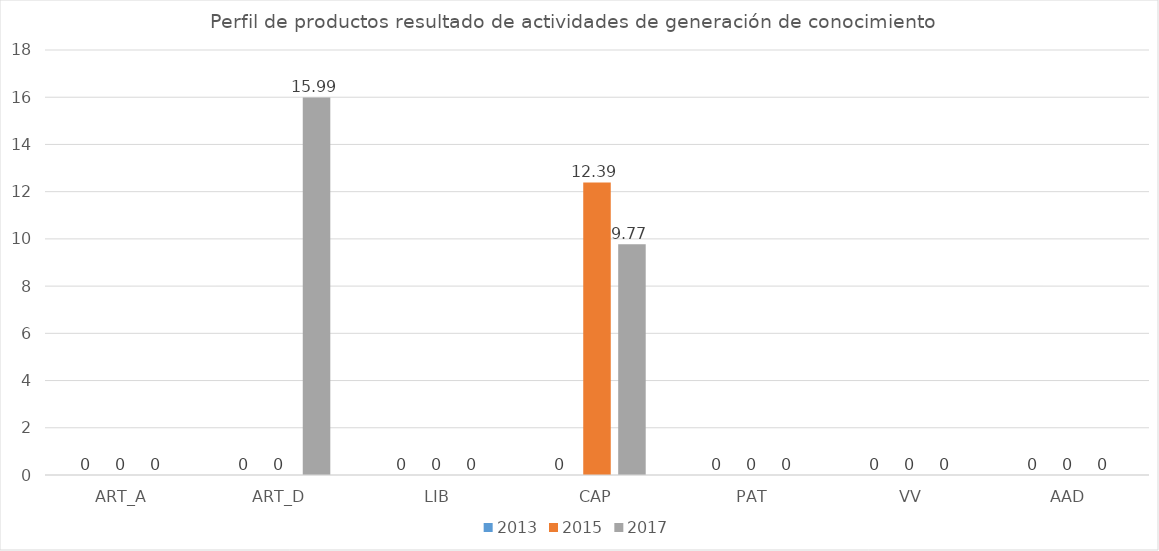
| Category | 2013 | 2015 | 2017 |
|---|---|---|---|
| ART_A | 0 | 0 | 0 |
| ART_D | 0 | 0 | 15.99 |
| LIB | 0 | 0 | 0 |
| CAP | 0 | 12.39 | 9.77 |
| PAT | 0 | 0 | 0 |
| VV | 0 | 0 | 0 |
| AAD | 0 | 0 | 0 |